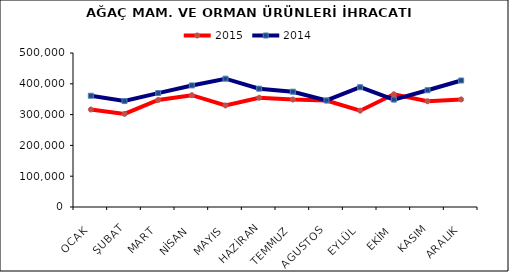
| Category | 2015 | 2014 |
|---|---|---|
| OCAK | 316523.641 | 361246.922 |
| ŞUBAT | 302168.277 | 343962.777 |
| MART | 347425.847 | 369861.935 |
| NİSAN | 363009.759 | 394698.187 |
| MAYIS | 329724.461 | 416559.651 |
| HAZİRAN | 354627.428 | 384157.806 |
| TEMMUZ | 348837.527 | 374374.45 |
| AGUSTOS | 345854.328 | 345848.773 |
| EYLÜL | 312703.952 | 388845.373 |
| EKİM | 365964.246 | 348688.39 |
| KASIM | 343303.46 | 379158.727 |
| ARALIK | 349258.931 | 410707.78 |